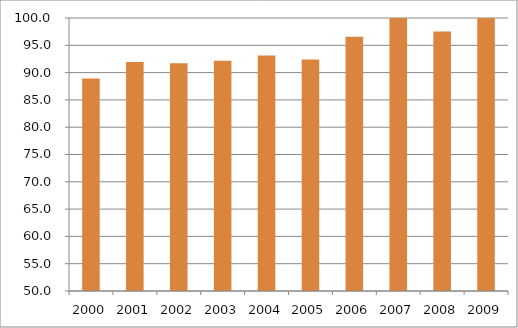
| Category | Região Centro-Oeste |
|---|---|
| 2000.0 | 88.93 |
| 2001.0 | 91.94 |
| 2002.0 | 91.7 |
| 2003.0 | 92.15 |
| 2004.0 | 93.14 |
| 2005.0 | 92.41 |
| 2006.0 | 96.56 |
| 2007.0 | 103.3 |
| 2008.0 | 97.52 |
| 2009.0 | 99.98 |